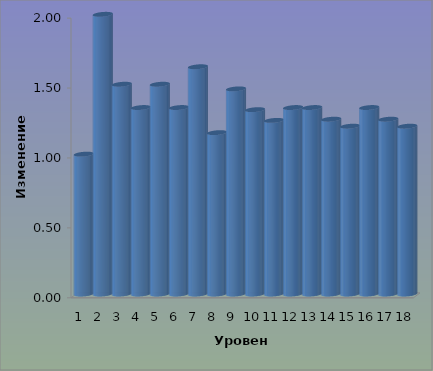
| Category | Series 0 |
|---|---|
| 0 | 1 |
| 1 | 2 |
| 2 | 1.5 |
| 3 | 1.333 |
| 4 | 1.5 |
| 5 | 1.333 |
| 6 | 1.625 |
| 7 | 1.154 |
| 8 | 1.467 |
| 9 | 1.318 |
| 10 | 1.241 |
| 11 | 1.333 |
| 12 | 1.333 |
| 13 | 1.25 |
| 14 | 1.2 |
| 15 | 1.333 |
| 16 | 1.25 |
| 17 | 1.2 |